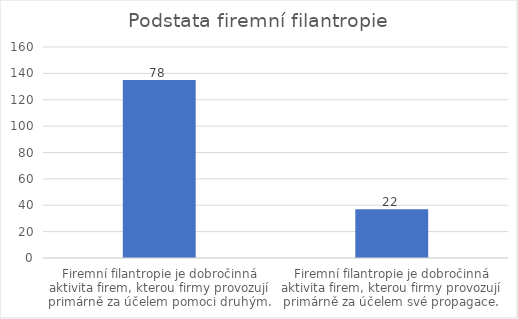
| Category | Počet respondentů |
|---|---|
| Firemní filantropie je dobročinná aktivita firem, kterou firmy provozují primárně za účelem pomoci druhým. | 135 |
| Firemní filantropie je dobročinná aktivita firem, kterou firmy provozují primárně za účelem své propagace. | 37 |